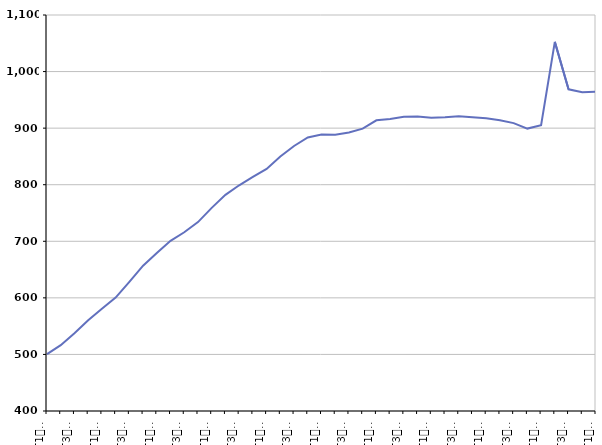
| Category | 50 ans ou plus |
|---|---|
| T1
2011 | 500.4 |
| T2
2011 | 516.3 |
| T3
2011 | 537.6 |
| T4
2011 | 560.4 |
| T1
2012 | 580.9 |
| T2
2012 | 600.4 |
| T3
2012 | 628.3 |
| T4
2012 | 656.8 |
| T1
2013 | 679.2 |
| T2
2013 | 700.9 |
| T3
2013 | 715.9 |
| T4
2013 | 733.9 |
| T1
2014 | 759.1 |
| T2
2014 | 782.1 |
| T3
2014 | 799 |
| T4
2014 | 813.8 |
| T1
2015 | 827.9 |
| T2
2015 | 849.8 |
| T3
2015 | 868.5 |
| T4
2015 | 883.6 |
| T1
2016 | 888.6 |
| T2
2016 | 888.3 |
| T3
2016 | 892.2 |
| T4
2016 | 899.2 |
| T1
2017 | 913.8 |
| T2
2017 | 916.2 |
| T3
2017 | 920 |
| T4
2017 | 920.7 |
| T1
2018 | 918.4 |
| T2
2018 | 919.2 |
| T3
2018 | 921.1 |
| T4
2018 | 919.4 |
| T1
2019 | 917.6 |
| T2
2019 | 913.9 |
| T3
2019 | 908.9 |
| T4
2019 | 899.2 |
| T1
2020 | 905.2 |
| T2
2020 | 1052.5 |
| T3
2020 | 968.7 |
| T4
2020 | 963.3 |
| T1
2021 | 964.2 |